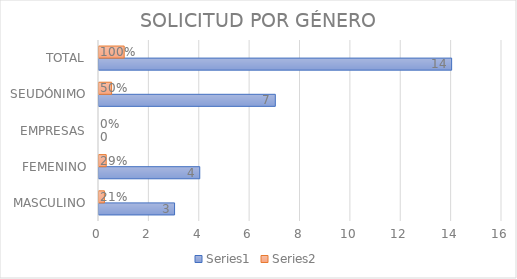
| Category | Series 0 | Series 1 |
|---|---|---|
| MASCULINO | 3 | 0.214 |
| FEMENINO | 4 | 0.286 |
| EMPRESAS | 0 | 0 |
| SEUDÓNIMO | 7 | 0.5 |
| TOTAL | 14 | 1 |